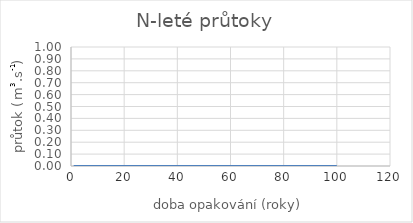
| Category | N-leté průtoky |
|---|---|
| 1.0 | 0 |
| 2.0 | 0 |
| 5.0 | 0 |
| 10.0 | 0 |
| 20.0 | 0 |
| 50.0 | 0 |
| 100.0 | 0 |